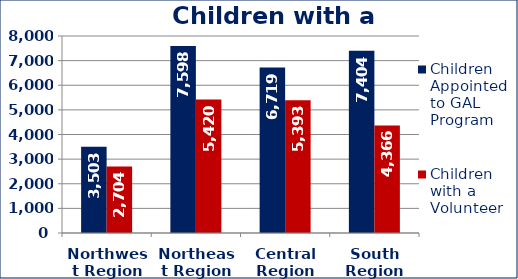
| Category | Children Appointed to GAL Program  | Children with a Volunteer  |
|---|---|---|
| Northwest Region | 3503 | 2704 |
| Northeast Region | 7598 | 5420 |
| Central Region | 6719 | 5393 |
| South Region | 7404 | 4366 |